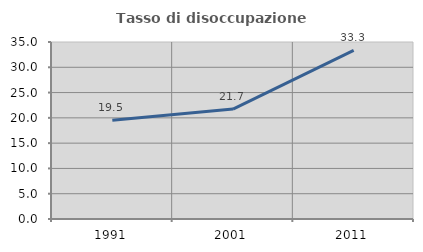
| Category | Tasso di disoccupazione giovanile  |
|---|---|
| 1991.0 | 19.512 |
| 2001.0 | 21.739 |
| 2011.0 | 33.333 |